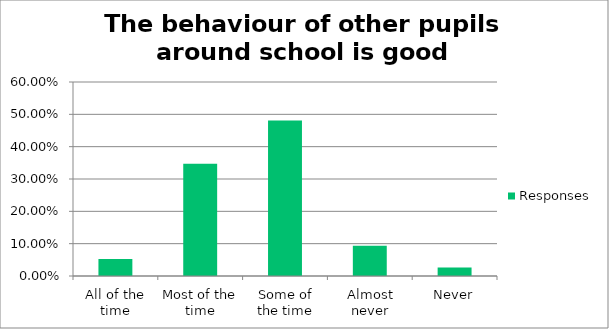
| Category | Responses |
|---|---|
| All of the time | 0.052 |
| Most of the time | 0.347 |
| Some of the time | 0.481 |
| Almost never | 0.093 |
| Never | 0.026 |